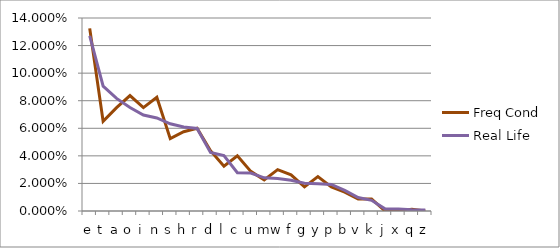
| Category | Freq Cond | Real Life |
|---|---|---|
| e | 0.132 | 0.127 |
| t | 0.065 | 0.091 |
| a | 0.075 | 0.082 |
| o | 0.084 | 0.075 |
| i | 0.075 | 0.07 |
| n | 0.082 | 0.068 |
| s | 0.052 | 0.063 |
| h | 0.058 | 0.061 |
| r | 0.06 | 0.06 |
| d | 0.044 | 0.043 |
| l | 0.032 | 0.04 |
| c | 0.04 | 0.028 |
| u | 0.029 | 0.028 |
| m | 0.022 | 0.024 |
| w | 0.03 | 0.024 |
| f | 0.026 | 0.022 |
| g | 0.018 | 0.02 |
| y | 0.025 | 0.02 |
| p | 0.018 | 0.019 |
| b | 0.014 | 0.015 |
| v | 0.009 | 0.01 |
| k | 0.009 | 0.008 |
| j | 0 | 0.002 |
| x | 0 | 0.002 |
| q | 0.001 | 0.001 |
| z | 0 | 0.001 |